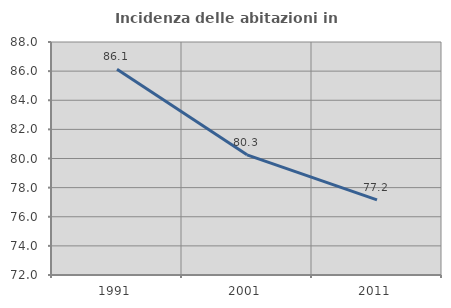
| Category | Incidenza delle abitazioni in proprietà  |
|---|---|
| 1991.0 | 86.133 |
| 2001.0 | 80.254 |
| 2011.0 | 77.159 |